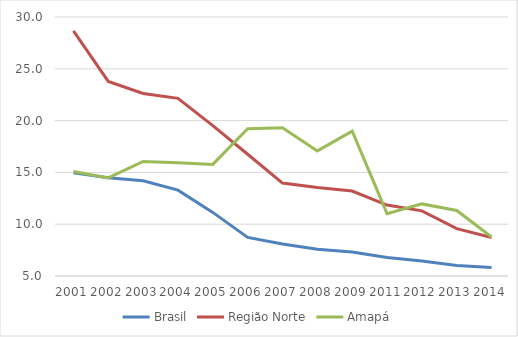
| Category | Brasil | Região Norte | Amapá |
|---|---|---|---|
| 2001.0 | 14.955 | 28.66 | 15.093 |
| 2002.0 | 14.475 | 23.779 | 14.462 |
| 2003.0 | 14.19 | 22.619 | 16.058 |
| 2004.0 | 13.285 | 22.145 | 15.922 |
| 2005.0 | 11.14 | 19.518 | 15.772 |
| 2006.0 | 8.721 | 16.753 | 19.214 |
| 2007.0 | 8.08 | 13.97 | 19.298 |
| 2008.0 | 7.593 | 13.543 | 17.073 |
| 2009.0 | 7.309 | 13.198 | 18.984 |
| 2011.0 | 6.776 | 11.848 | 11.022 |
| 2012.0 | 6.452 | 11.29 | 11.958 |
| 2013.0 | 6.009 | 9.568 | 11.329 |
| 2014.0 | 5.816 | 8.718 | 8.766 |